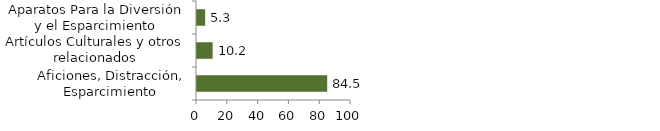
| Category | Cultura, diversión y esparcimiento |
|---|---|
| Aficiones, Distracción, Esparcimiento | 84.547 |
| Artículos Culturales y otros relacionados | 10.166 |
| Aparatos Para la Diversión y el Esparcimiento | 5.287 |